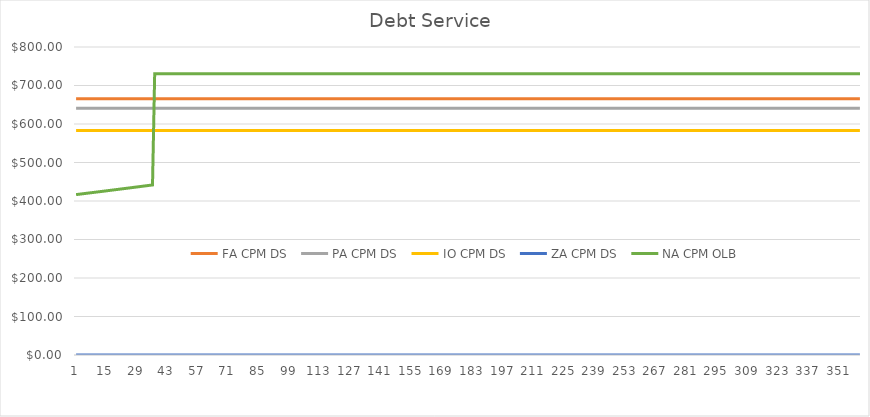
| Category | FA CPM DS | PA CPM DS | IO CPM DS | ZA CPM DS | NA CPM OLB |
|---|---|---|---|---|---|
| 0 | 665.302 | 640.712 | 583.333 | 0 | 416.667 |
| 1 | 665.302 | 640.712 | 583.333 | 0 | 417.361 |
| 2 | 665.302 | 640.712 | 583.333 | 0 | 418.057 |
| 3 | 665.302 | 640.712 | 583.333 | 0 | 418.753 |
| 4 | 665.302 | 640.712 | 583.333 | 0 | 419.451 |
| 5 | 665.302 | 640.712 | 583.333 | 0 | 420.15 |
| 6 | 665.302 | 640.712 | 583.333 | 0 | 420.851 |
| 7 | 665.302 | 640.712 | 583.333 | 0 | 421.552 |
| 8 | 665.302 | 640.712 | 583.333 | 0 | 422.255 |
| 9 | 665.302 | 640.712 | 583.333 | 0 | 422.958 |
| 10 | 665.302 | 640.712 | 583.333 | 0 | 423.663 |
| 11 | 665.302 | 640.712 | 583.333 | 0 | 424.37 |
| 12 | 665.302 | 640.712 | 583.333 | 0 | 425.077 |
| 13 | 665.302 | 640.712 | 583.333 | 0 | 425.785 |
| 14 | 665.302 | 640.712 | 583.333 | 0 | 426.495 |
| 15 | 665.302 | 640.712 | 583.333 | 0 | 427.206 |
| 16 | 665.302 | 640.712 | 583.333 | 0 | 427.918 |
| 17 | 665.302 | 640.712 | 583.333 | 0 | 428.631 |
| 18 | 665.302 | 640.712 | 583.333 | 0 | 429.345 |
| 19 | 665.302 | 640.712 | 583.333 | 0 | 430.061 |
| 20 | 665.302 | 640.712 | 583.333 | 0 | 430.778 |
| 21 | 665.302 | 640.712 | 583.333 | 0 | 431.496 |
| 22 | 665.302 | 640.712 | 583.333 | 0 | 432.215 |
| 23 | 665.302 | 640.712 | 583.333 | 0 | 432.935 |
| 24 | 665.302 | 640.712 | 583.333 | 0 | 433.657 |
| 25 | 665.302 | 640.712 | 583.333 | 0 | 434.379 |
| 26 | 665.302 | 640.712 | 583.333 | 0 | 435.103 |
| 27 | 665.302 | 640.712 | 583.333 | 0 | 435.829 |
| 28 | 665.302 | 640.712 | 583.333 | 0 | 436.555 |
| 29 | 665.302 | 640.712 | 583.333 | 0 | 437.283 |
| 30 | 665.302 | 640.712 | 583.333 | 0 | 438.011 |
| 31 | 665.302 | 640.712 | 583.333 | 0 | 438.741 |
| 32 | 665.302 | 640.712 | 583.333 | 0 | 439.473 |
| 33 | 665.302 | 640.712 | 583.333 | 0 | 440.205 |
| 34 | 665.302 | 640.712 | 583.333 | 0 | 440.939 |
| 35 | 665.302 | 640.712 | 583.333 | 0 | 441.674 |
| 36 | 665.302 | 640.712 | 583.333 | 0 | 730.311 |
| 37 | 665.302 | 640.712 | 583.333 | 0 | 730.311 |
| 38 | 665.302 | 640.712 | 583.333 | 0 | 730.311 |
| 39 | 665.302 | 640.712 | 583.333 | 0 | 730.311 |
| 40 | 665.302 | 640.712 | 583.333 | 0 | 730.311 |
| 41 | 665.302 | 640.712 | 583.333 | 0 | 730.311 |
| 42 | 665.302 | 640.712 | 583.333 | 0 | 730.311 |
| 43 | 665.302 | 640.712 | 583.333 | 0 | 730.311 |
| 44 | 665.302 | 640.712 | 583.333 | 0 | 730.311 |
| 45 | 665.302 | 640.712 | 583.333 | 0 | 730.311 |
| 46 | 665.302 | 640.712 | 583.333 | 0 | 730.311 |
| 47 | 665.302 | 640.712 | 583.333 | 0 | 730.311 |
| 48 | 665.302 | 640.712 | 583.333 | 0 | 730.311 |
| 49 | 665.302 | 640.712 | 583.333 | 0 | 730.311 |
| 50 | 665.302 | 640.712 | 583.333 | 0 | 730.311 |
| 51 | 665.302 | 640.712 | 583.333 | 0 | 730.311 |
| 52 | 665.302 | 640.712 | 583.333 | 0 | 730.311 |
| 53 | 665.302 | 640.712 | 583.333 | 0 | 730.311 |
| 54 | 665.302 | 640.712 | 583.333 | 0 | 730.311 |
| 55 | 665.302 | 640.712 | 583.333 | 0 | 730.311 |
| 56 | 665.302 | 640.712 | 583.333 | 0 | 730.311 |
| 57 | 665.302 | 640.712 | 583.333 | 0 | 730.311 |
| 58 | 665.302 | 640.712 | 583.333 | 0 | 730.311 |
| 59 | 665.302 | 640.712 | 583.333 | 0 | 730.311 |
| 60 | 665.302 | 640.712 | 583.333 | 0 | 730.311 |
| 61 | 665.302 | 640.712 | 583.333 | 0 | 730.311 |
| 62 | 665.302 | 640.712 | 583.333 | 0 | 730.311 |
| 63 | 665.302 | 640.712 | 583.333 | 0 | 730.311 |
| 64 | 665.302 | 640.712 | 583.333 | 0 | 730.311 |
| 65 | 665.302 | 640.712 | 583.333 | 0 | 730.311 |
| 66 | 665.302 | 640.712 | 583.333 | 0 | 730.311 |
| 67 | 665.302 | 640.712 | 583.333 | 0 | 730.311 |
| 68 | 665.302 | 640.712 | 583.333 | 0 | 730.311 |
| 69 | 665.302 | 640.712 | 583.333 | 0 | 730.311 |
| 70 | 665.302 | 640.712 | 583.333 | 0 | 730.311 |
| 71 | 665.302 | 640.712 | 583.333 | 0 | 730.311 |
| 72 | 665.302 | 640.712 | 583.333 | 0 | 730.311 |
| 73 | 665.302 | 640.712 | 583.333 | 0 | 730.311 |
| 74 | 665.302 | 640.712 | 583.333 | 0 | 730.311 |
| 75 | 665.302 | 640.712 | 583.333 | 0 | 730.311 |
| 76 | 665.302 | 640.712 | 583.333 | 0 | 730.311 |
| 77 | 665.302 | 640.712 | 583.333 | 0 | 730.311 |
| 78 | 665.302 | 640.712 | 583.333 | 0 | 730.311 |
| 79 | 665.302 | 640.712 | 583.333 | 0 | 730.311 |
| 80 | 665.302 | 640.712 | 583.333 | 0 | 730.311 |
| 81 | 665.302 | 640.712 | 583.333 | 0 | 730.311 |
| 82 | 665.302 | 640.712 | 583.333 | 0 | 730.311 |
| 83 | 665.302 | 640.712 | 583.333 | 0 | 730.311 |
| 84 | 665.302 | 640.712 | 583.333 | 0 | 730.311 |
| 85 | 665.302 | 640.712 | 583.333 | 0 | 730.311 |
| 86 | 665.302 | 640.712 | 583.333 | 0 | 730.311 |
| 87 | 665.302 | 640.712 | 583.333 | 0 | 730.311 |
| 88 | 665.302 | 640.712 | 583.333 | 0 | 730.311 |
| 89 | 665.302 | 640.712 | 583.333 | 0 | 730.311 |
| 90 | 665.302 | 640.712 | 583.333 | 0 | 730.311 |
| 91 | 665.302 | 640.712 | 583.333 | 0 | 730.311 |
| 92 | 665.302 | 640.712 | 583.333 | 0 | 730.311 |
| 93 | 665.302 | 640.712 | 583.333 | 0 | 730.311 |
| 94 | 665.302 | 640.712 | 583.333 | 0 | 730.311 |
| 95 | 665.302 | 640.712 | 583.333 | 0 | 730.311 |
| 96 | 665.302 | 640.712 | 583.333 | 0 | 730.311 |
| 97 | 665.302 | 640.712 | 583.333 | 0 | 730.311 |
| 98 | 665.302 | 640.712 | 583.333 | 0 | 730.311 |
| 99 | 665.302 | 640.712 | 583.333 | 0 | 730.311 |
| 100 | 665.302 | 640.712 | 583.333 | 0 | 730.311 |
| 101 | 665.302 | 640.712 | 583.333 | 0 | 730.311 |
| 102 | 665.302 | 640.712 | 583.333 | 0 | 730.311 |
| 103 | 665.302 | 640.712 | 583.333 | 0 | 730.311 |
| 104 | 665.302 | 640.712 | 583.333 | 0 | 730.311 |
| 105 | 665.302 | 640.712 | 583.333 | 0 | 730.311 |
| 106 | 665.302 | 640.712 | 583.333 | 0 | 730.311 |
| 107 | 665.302 | 640.712 | 583.333 | 0 | 730.311 |
| 108 | 665.302 | 640.712 | 583.333 | 0 | 730.311 |
| 109 | 665.302 | 640.712 | 583.333 | 0 | 730.311 |
| 110 | 665.302 | 640.712 | 583.333 | 0 | 730.311 |
| 111 | 665.302 | 640.712 | 583.333 | 0 | 730.311 |
| 112 | 665.302 | 640.712 | 583.333 | 0 | 730.311 |
| 113 | 665.302 | 640.712 | 583.333 | 0 | 730.311 |
| 114 | 665.302 | 640.712 | 583.333 | 0 | 730.311 |
| 115 | 665.302 | 640.712 | 583.333 | 0 | 730.311 |
| 116 | 665.302 | 640.712 | 583.333 | 0 | 730.311 |
| 117 | 665.302 | 640.712 | 583.333 | 0 | 730.311 |
| 118 | 665.302 | 640.712 | 583.333 | 0 | 730.311 |
| 119 | 665.302 | 640.712 | 583.333 | 0 | 730.311 |
| 120 | 665.302 | 640.712 | 583.333 | 0 | 730.311 |
| 121 | 665.302 | 640.712 | 583.333 | 0 | 730.311 |
| 122 | 665.302 | 640.712 | 583.333 | 0 | 730.311 |
| 123 | 665.302 | 640.712 | 583.333 | 0 | 730.311 |
| 124 | 665.302 | 640.712 | 583.333 | 0 | 730.311 |
| 125 | 665.302 | 640.712 | 583.333 | 0 | 730.311 |
| 126 | 665.302 | 640.712 | 583.333 | 0 | 730.311 |
| 127 | 665.302 | 640.712 | 583.333 | 0 | 730.311 |
| 128 | 665.302 | 640.712 | 583.333 | 0 | 730.311 |
| 129 | 665.302 | 640.712 | 583.333 | 0 | 730.311 |
| 130 | 665.302 | 640.712 | 583.333 | 0 | 730.311 |
| 131 | 665.302 | 640.712 | 583.333 | 0 | 730.311 |
| 132 | 665.302 | 640.712 | 583.333 | 0 | 730.311 |
| 133 | 665.302 | 640.712 | 583.333 | 0 | 730.311 |
| 134 | 665.302 | 640.712 | 583.333 | 0 | 730.311 |
| 135 | 665.302 | 640.712 | 583.333 | 0 | 730.311 |
| 136 | 665.302 | 640.712 | 583.333 | 0 | 730.311 |
| 137 | 665.302 | 640.712 | 583.333 | 0 | 730.311 |
| 138 | 665.302 | 640.712 | 583.333 | 0 | 730.311 |
| 139 | 665.302 | 640.712 | 583.333 | 0 | 730.311 |
| 140 | 665.302 | 640.712 | 583.333 | 0 | 730.311 |
| 141 | 665.302 | 640.712 | 583.333 | 0 | 730.311 |
| 142 | 665.302 | 640.712 | 583.333 | 0 | 730.311 |
| 143 | 665.302 | 640.712 | 583.333 | 0 | 730.311 |
| 144 | 665.302 | 640.712 | 583.333 | 0 | 730.311 |
| 145 | 665.302 | 640.712 | 583.333 | 0 | 730.311 |
| 146 | 665.302 | 640.712 | 583.333 | 0 | 730.311 |
| 147 | 665.302 | 640.712 | 583.333 | 0 | 730.311 |
| 148 | 665.302 | 640.712 | 583.333 | 0 | 730.311 |
| 149 | 665.302 | 640.712 | 583.333 | 0 | 730.311 |
| 150 | 665.302 | 640.712 | 583.333 | 0 | 730.311 |
| 151 | 665.302 | 640.712 | 583.333 | 0 | 730.311 |
| 152 | 665.302 | 640.712 | 583.333 | 0 | 730.311 |
| 153 | 665.302 | 640.712 | 583.333 | 0 | 730.311 |
| 154 | 665.302 | 640.712 | 583.333 | 0 | 730.311 |
| 155 | 665.302 | 640.712 | 583.333 | 0 | 730.311 |
| 156 | 665.302 | 640.712 | 583.333 | 0 | 730.311 |
| 157 | 665.302 | 640.712 | 583.333 | 0 | 730.311 |
| 158 | 665.302 | 640.712 | 583.333 | 0 | 730.311 |
| 159 | 665.302 | 640.712 | 583.333 | 0 | 730.311 |
| 160 | 665.302 | 640.712 | 583.333 | 0 | 730.311 |
| 161 | 665.302 | 640.712 | 583.333 | 0 | 730.311 |
| 162 | 665.302 | 640.712 | 583.333 | 0 | 730.311 |
| 163 | 665.302 | 640.712 | 583.333 | 0 | 730.311 |
| 164 | 665.302 | 640.712 | 583.333 | 0 | 730.311 |
| 165 | 665.302 | 640.712 | 583.333 | 0 | 730.311 |
| 166 | 665.302 | 640.712 | 583.333 | 0 | 730.311 |
| 167 | 665.302 | 640.712 | 583.333 | 0 | 730.311 |
| 168 | 665.302 | 640.712 | 583.333 | 0 | 730.311 |
| 169 | 665.302 | 640.712 | 583.333 | 0 | 730.311 |
| 170 | 665.302 | 640.712 | 583.333 | 0 | 730.311 |
| 171 | 665.302 | 640.712 | 583.333 | 0 | 730.311 |
| 172 | 665.302 | 640.712 | 583.333 | 0 | 730.311 |
| 173 | 665.302 | 640.712 | 583.333 | 0 | 730.311 |
| 174 | 665.302 | 640.712 | 583.333 | 0 | 730.311 |
| 175 | 665.302 | 640.712 | 583.333 | 0 | 730.311 |
| 176 | 665.302 | 640.712 | 583.333 | 0 | 730.311 |
| 177 | 665.302 | 640.712 | 583.333 | 0 | 730.311 |
| 178 | 665.302 | 640.712 | 583.333 | 0 | 730.311 |
| 179 | 665.302 | 640.712 | 583.333 | 0 | 730.311 |
| 180 | 665.302 | 640.712 | 583.333 | 0 | 730.311 |
| 181 | 665.302 | 640.712 | 583.333 | 0 | 730.311 |
| 182 | 665.302 | 640.712 | 583.333 | 0 | 730.311 |
| 183 | 665.302 | 640.712 | 583.333 | 0 | 730.311 |
| 184 | 665.302 | 640.712 | 583.333 | 0 | 730.311 |
| 185 | 665.302 | 640.712 | 583.333 | 0 | 730.311 |
| 186 | 665.302 | 640.712 | 583.333 | 0 | 730.311 |
| 187 | 665.302 | 640.712 | 583.333 | 0 | 730.311 |
| 188 | 665.302 | 640.712 | 583.333 | 0 | 730.311 |
| 189 | 665.302 | 640.712 | 583.333 | 0 | 730.311 |
| 190 | 665.302 | 640.712 | 583.333 | 0 | 730.311 |
| 191 | 665.302 | 640.712 | 583.333 | 0 | 730.311 |
| 192 | 665.302 | 640.712 | 583.333 | 0 | 730.311 |
| 193 | 665.302 | 640.712 | 583.333 | 0 | 730.311 |
| 194 | 665.302 | 640.712 | 583.333 | 0 | 730.311 |
| 195 | 665.302 | 640.712 | 583.333 | 0 | 730.311 |
| 196 | 665.302 | 640.712 | 583.333 | 0 | 730.311 |
| 197 | 665.302 | 640.712 | 583.333 | 0 | 730.311 |
| 198 | 665.302 | 640.712 | 583.333 | 0 | 730.311 |
| 199 | 665.302 | 640.712 | 583.333 | 0 | 730.311 |
| 200 | 665.302 | 640.712 | 583.333 | 0 | 730.311 |
| 201 | 665.302 | 640.712 | 583.333 | 0 | 730.311 |
| 202 | 665.302 | 640.712 | 583.333 | 0 | 730.311 |
| 203 | 665.302 | 640.712 | 583.333 | 0 | 730.311 |
| 204 | 665.302 | 640.712 | 583.333 | 0 | 730.311 |
| 205 | 665.302 | 640.712 | 583.333 | 0 | 730.311 |
| 206 | 665.302 | 640.712 | 583.333 | 0 | 730.311 |
| 207 | 665.302 | 640.712 | 583.333 | 0 | 730.311 |
| 208 | 665.302 | 640.712 | 583.333 | 0 | 730.311 |
| 209 | 665.302 | 640.712 | 583.333 | 0 | 730.311 |
| 210 | 665.302 | 640.712 | 583.333 | 0 | 730.311 |
| 211 | 665.302 | 640.712 | 583.333 | 0 | 730.311 |
| 212 | 665.302 | 640.712 | 583.333 | 0 | 730.311 |
| 213 | 665.302 | 640.712 | 583.333 | 0 | 730.311 |
| 214 | 665.302 | 640.712 | 583.333 | 0 | 730.311 |
| 215 | 665.302 | 640.712 | 583.333 | 0 | 730.311 |
| 216 | 665.302 | 640.712 | 583.333 | 0 | 730.311 |
| 217 | 665.302 | 640.712 | 583.333 | 0 | 730.311 |
| 218 | 665.302 | 640.712 | 583.333 | 0 | 730.311 |
| 219 | 665.302 | 640.712 | 583.333 | 0 | 730.311 |
| 220 | 665.302 | 640.712 | 583.333 | 0 | 730.311 |
| 221 | 665.302 | 640.712 | 583.333 | 0 | 730.311 |
| 222 | 665.302 | 640.712 | 583.333 | 0 | 730.311 |
| 223 | 665.302 | 640.712 | 583.333 | 0 | 730.311 |
| 224 | 665.302 | 640.712 | 583.333 | 0 | 730.311 |
| 225 | 665.302 | 640.712 | 583.333 | 0 | 730.311 |
| 226 | 665.302 | 640.712 | 583.333 | 0 | 730.311 |
| 227 | 665.302 | 640.712 | 583.333 | 0 | 730.311 |
| 228 | 665.302 | 640.712 | 583.333 | 0 | 730.311 |
| 229 | 665.302 | 640.712 | 583.333 | 0 | 730.311 |
| 230 | 665.302 | 640.712 | 583.333 | 0 | 730.311 |
| 231 | 665.302 | 640.712 | 583.333 | 0 | 730.311 |
| 232 | 665.302 | 640.712 | 583.333 | 0 | 730.311 |
| 233 | 665.302 | 640.712 | 583.333 | 0 | 730.311 |
| 234 | 665.302 | 640.712 | 583.333 | 0 | 730.311 |
| 235 | 665.302 | 640.712 | 583.333 | 0 | 730.311 |
| 236 | 665.302 | 640.712 | 583.333 | 0 | 730.311 |
| 237 | 665.302 | 640.712 | 583.333 | 0 | 730.311 |
| 238 | 665.302 | 640.712 | 583.333 | 0 | 730.311 |
| 239 | 665.302 | 640.712 | 583.333 | 0 | 730.311 |
| 240 | 665.302 | 640.712 | 583.333 | 0 | 730.311 |
| 241 | 665.302 | 640.712 | 583.333 | 0 | 730.311 |
| 242 | 665.302 | 640.712 | 583.333 | 0 | 730.311 |
| 243 | 665.302 | 640.712 | 583.333 | 0 | 730.311 |
| 244 | 665.302 | 640.712 | 583.333 | 0 | 730.311 |
| 245 | 665.302 | 640.712 | 583.333 | 0 | 730.311 |
| 246 | 665.302 | 640.712 | 583.333 | 0 | 730.311 |
| 247 | 665.302 | 640.712 | 583.333 | 0 | 730.311 |
| 248 | 665.302 | 640.712 | 583.333 | 0 | 730.311 |
| 249 | 665.302 | 640.712 | 583.333 | 0 | 730.311 |
| 250 | 665.302 | 640.712 | 583.333 | 0 | 730.311 |
| 251 | 665.302 | 640.712 | 583.333 | 0 | 730.311 |
| 252 | 665.302 | 640.712 | 583.333 | 0 | 730.311 |
| 253 | 665.302 | 640.712 | 583.333 | 0 | 730.311 |
| 254 | 665.302 | 640.712 | 583.333 | 0 | 730.311 |
| 255 | 665.302 | 640.712 | 583.333 | 0 | 730.311 |
| 256 | 665.302 | 640.712 | 583.333 | 0 | 730.311 |
| 257 | 665.302 | 640.712 | 583.333 | 0 | 730.311 |
| 258 | 665.302 | 640.712 | 583.333 | 0 | 730.311 |
| 259 | 665.302 | 640.712 | 583.333 | 0 | 730.311 |
| 260 | 665.302 | 640.712 | 583.333 | 0 | 730.311 |
| 261 | 665.302 | 640.712 | 583.333 | 0 | 730.311 |
| 262 | 665.302 | 640.712 | 583.333 | 0 | 730.311 |
| 263 | 665.302 | 640.712 | 583.333 | 0 | 730.311 |
| 264 | 665.302 | 640.712 | 583.333 | 0 | 730.311 |
| 265 | 665.302 | 640.712 | 583.333 | 0 | 730.311 |
| 266 | 665.302 | 640.712 | 583.333 | 0 | 730.311 |
| 267 | 665.302 | 640.712 | 583.333 | 0 | 730.311 |
| 268 | 665.302 | 640.712 | 583.333 | 0 | 730.311 |
| 269 | 665.302 | 640.712 | 583.333 | 0 | 730.311 |
| 270 | 665.302 | 640.712 | 583.333 | 0 | 730.311 |
| 271 | 665.302 | 640.712 | 583.333 | 0 | 730.311 |
| 272 | 665.302 | 640.712 | 583.333 | 0 | 730.311 |
| 273 | 665.302 | 640.712 | 583.333 | 0 | 730.311 |
| 274 | 665.302 | 640.712 | 583.333 | 0 | 730.311 |
| 275 | 665.302 | 640.712 | 583.333 | 0 | 730.311 |
| 276 | 665.302 | 640.712 | 583.333 | 0 | 730.311 |
| 277 | 665.302 | 640.712 | 583.333 | 0 | 730.311 |
| 278 | 665.302 | 640.712 | 583.333 | 0 | 730.311 |
| 279 | 665.302 | 640.712 | 583.333 | 0 | 730.311 |
| 280 | 665.302 | 640.712 | 583.333 | 0 | 730.311 |
| 281 | 665.302 | 640.712 | 583.333 | 0 | 730.311 |
| 282 | 665.302 | 640.712 | 583.333 | 0 | 730.311 |
| 283 | 665.302 | 640.712 | 583.333 | 0 | 730.311 |
| 284 | 665.302 | 640.712 | 583.333 | 0 | 730.311 |
| 285 | 665.302 | 640.712 | 583.333 | 0 | 730.311 |
| 286 | 665.302 | 640.712 | 583.333 | 0 | 730.311 |
| 287 | 665.302 | 640.712 | 583.333 | 0 | 730.311 |
| 288 | 665.302 | 640.712 | 583.333 | 0 | 730.311 |
| 289 | 665.302 | 640.712 | 583.333 | 0 | 730.311 |
| 290 | 665.302 | 640.712 | 583.333 | 0 | 730.311 |
| 291 | 665.302 | 640.712 | 583.333 | 0 | 730.311 |
| 292 | 665.302 | 640.712 | 583.333 | 0 | 730.311 |
| 293 | 665.302 | 640.712 | 583.333 | 0 | 730.311 |
| 294 | 665.302 | 640.712 | 583.333 | 0 | 730.311 |
| 295 | 665.302 | 640.712 | 583.333 | 0 | 730.311 |
| 296 | 665.302 | 640.712 | 583.333 | 0 | 730.311 |
| 297 | 665.302 | 640.712 | 583.333 | 0 | 730.311 |
| 298 | 665.302 | 640.712 | 583.333 | 0 | 730.311 |
| 299 | 665.302 | 640.712 | 583.333 | 0 | 730.311 |
| 300 | 665.302 | 640.712 | 583.333 | 0 | 730.311 |
| 301 | 665.302 | 640.712 | 583.333 | 0 | 730.311 |
| 302 | 665.302 | 640.712 | 583.333 | 0 | 730.311 |
| 303 | 665.302 | 640.712 | 583.333 | 0 | 730.311 |
| 304 | 665.302 | 640.712 | 583.333 | 0 | 730.311 |
| 305 | 665.302 | 640.712 | 583.333 | 0 | 730.311 |
| 306 | 665.302 | 640.712 | 583.333 | 0 | 730.311 |
| 307 | 665.302 | 640.712 | 583.333 | 0 | 730.311 |
| 308 | 665.302 | 640.712 | 583.333 | 0 | 730.311 |
| 309 | 665.302 | 640.712 | 583.333 | 0 | 730.311 |
| 310 | 665.302 | 640.712 | 583.333 | 0 | 730.311 |
| 311 | 665.302 | 640.712 | 583.333 | 0 | 730.311 |
| 312 | 665.302 | 640.712 | 583.333 | 0 | 730.311 |
| 313 | 665.302 | 640.712 | 583.333 | 0 | 730.311 |
| 314 | 665.302 | 640.712 | 583.333 | 0 | 730.311 |
| 315 | 665.302 | 640.712 | 583.333 | 0 | 730.311 |
| 316 | 665.302 | 640.712 | 583.333 | 0 | 730.311 |
| 317 | 665.302 | 640.712 | 583.333 | 0 | 730.311 |
| 318 | 665.302 | 640.712 | 583.333 | 0 | 730.311 |
| 319 | 665.302 | 640.712 | 583.333 | 0 | 730.311 |
| 320 | 665.302 | 640.712 | 583.333 | 0 | 730.311 |
| 321 | 665.302 | 640.712 | 583.333 | 0 | 730.311 |
| 322 | 665.302 | 640.712 | 583.333 | 0 | 730.311 |
| 323 | 665.302 | 640.712 | 583.333 | 0 | 730.311 |
| 324 | 665.302 | 640.712 | 583.333 | 0 | 730.311 |
| 325 | 665.302 | 640.712 | 583.333 | 0 | 730.311 |
| 326 | 665.302 | 640.712 | 583.333 | 0 | 730.311 |
| 327 | 665.302 | 640.712 | 583.333 | 0 | 730.311 |
| 328 | 665.302 | 640.712 | 583.333 | 0 | 730.311 |
| 329 | 665.302 | 640.712 | 583.333 | 0 | 730.311 |
| 330 | 665.302 | 640.712 | 583.333 | 0 | 730.311 |
| 331 | 665.302 | 640.712 | 583.333 | 0 | 730.311 |
| 332 | 665.302 | 640.712 | 583.333 | 0 | 730.311 |
| 333 | 665.302 | 640.712 | 583.333 | 0 | 730.311 |
| 334 | 665.302 | 640.712 | 583.333 | 0 | 730.311 |
| 335 | 665.302 | 640.712 | 583.333 | 0 | 730.311 |
| 336 | 665.302 | 640.712 | 583.333 | 0 | 730.311 |
| 337 | 665.302 | 640.712 | 583.333 | 0 | 730.311 |
| 338 | 665.302 | 640.712 | 583.333 | 0 | 730.311 |
| 339 | 665.302 | 640.712 | 583.333 | 0 | 730.311 |
| 340 | 665.302 | 640.712 | 583.333 | 0 | 730.311 |
| 341 | 665.302 | 640.712 | 583.333 | 0 | 730.311 |
| 342 | 665.302 | 640.712 | 583.333 | 0 | 730.311 |
| 343 | 665.302 | 640.712 | 583.333 | 0 | 730.311 |
| 344 | 665.302 | 640.712 | 583.333 | 0 | 730.311 |
| 345 | 665.302 | 640.712 | 583.333 | 0 | 730.311 |
| 346 | 665.302 | 640.712 | 583.333 | 0 | 730.311 |
| 347 | 665.302 | 640.712 | 583.333 | 0 | 730.311 |
| 348 | 665.302 | 640.712 | 583.333 | 0 | 730.311 |
| 349 | 665.302 | 640.712 | 583.333 | 0 | 730.311 |
| 350 | 665.302 | 640.712 | 583.333 | 0 | 730.311 |
| 351 | 665.302 | 640.712 | 583.333 | 0 | 730.311 |
| 352 | 665.302 | 640.712 | 583.333 | 0 | 730.311 |
| 353 | 665.302 | 640.712 | 583.333 | 0 | 730.311 |
| 354 | 665.302 | 640.712 | 583.333 | 0 | 730.311 |
| 355 | 665.302 | 640.712 | 583.333 | 0 | 730.311 |
| 356 | 665.302 | 640.712 | 583.333 | 0 | 730.311 |
| 357 | 665.302 | 640.712 | 583.333 | 0 | 730.311 |
| 358 | 665.302 | 640.712 | 583.333 | 0 | 730.311 |
| 359 | 665.302 | 640.712 | 583.333 | 0 | 730.311 |